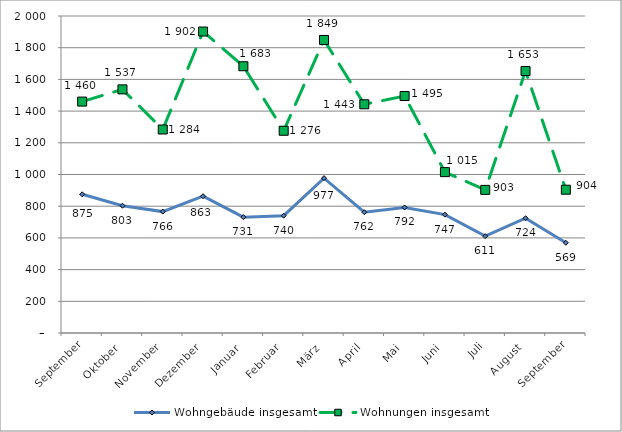
| Category | Wohngebäude insgesamt | Wohnungen insgesamt |
|---|---|---|
| September | 875 | 1460 |
| Oktober | 803 | 1537 |
| November | 766 | 1284 |
| Dezember | 863 | 1902 |
| Januar | 731 | 1683 |
| Februar | 740 | 1276 |
| März | 977 | 1849 |
| April | 762 | 1443 |
| Mai | 792 | 1495 |
| Juni | 747 | 1015 |
| Juli | 611 | 903 |
| August | 724 | 1653 |
| September | 569 | 904 |